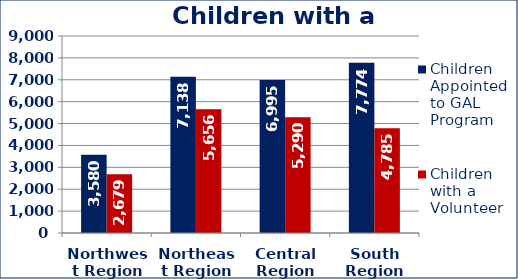
| Category | Children Appointed to GAL Program  | Children with a Volunteer  |
|---|---|---|
| Northwest Region | 3580 | 2679 |
| Northeast Region | 7138 | 5656 |
| Central Region | 6995 | 5290 |
| South Region | 7774 | 4785 |